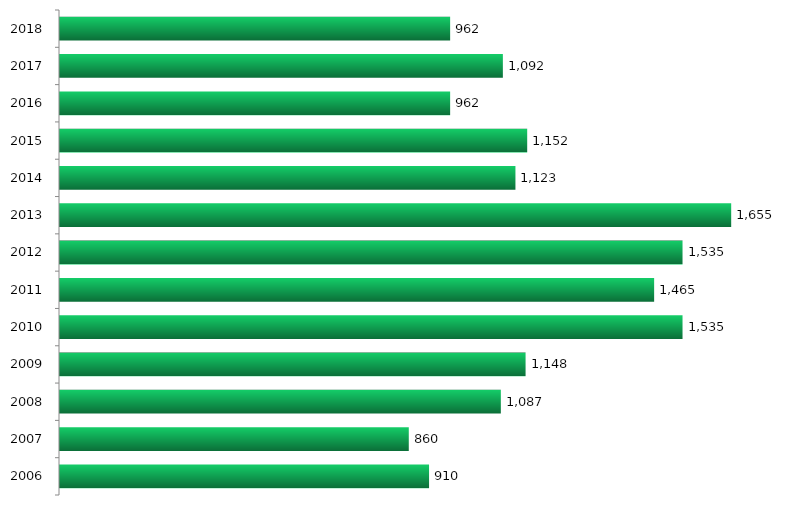
| Category | Vagas |
|---|---|
| 2006.0 | 910 |
| 2007.0 | 860 |
| 2008.0 | 1087 |
| 2009.0 | 1148 |
| 2010.0 | 1535 |
| 2011.0 | 1465 |
| 2012.0 | 1535 |
| 2013.0 | 1655 |
| 2014.0 | 1123 |
| 2015.0 | 1152 |
| 2016.0 | 962 |
| 2017.0 | 1092 |
| 2018.0 | 962 |